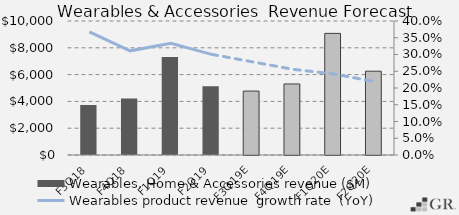
| Category | Wearables, Home & Accessories revenue ($M) |
|---|---|
|  F3Q18  | 3733 |
|  F4Q18  | 4223 |
|  F1Q19  | 7308 |
|  F2Q19  | 5129 |
|  F3Q19E  | 4771.131 |
|  F4Q19E  | 5302.868 |
|  F1Q20E  | 9075.799 |
|  F2Q20E  | 6252.459 |